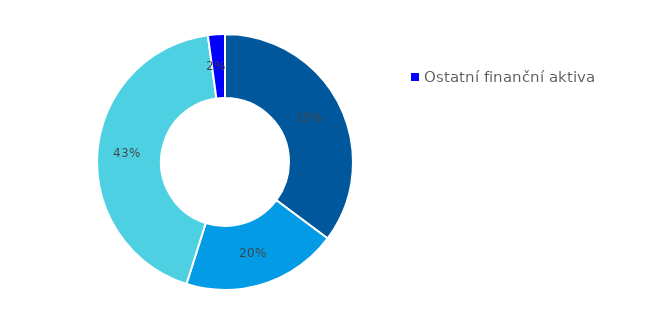
| Category | Series 0 |
|---|---|
| Hotovost | 0.352 |
| Půjčky poskytnuté nemovitostní společnosti | 0.197 |
| Majetkové účasti v nemovitostní společnosti | 0.43 |
| Ostatní finanční aktiva | 0.021 |